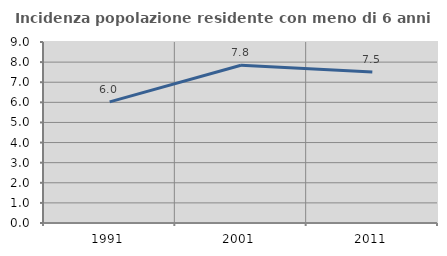
| Category | Incidenza popolazione residente con meno di 6 anni |
|---|---|
| 1991.0 | 6.025 |
| 2001.0 | 7.845 |
| 2011.0 | 7.506 |